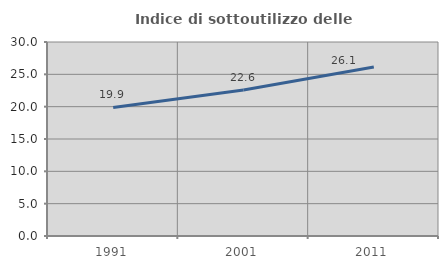
| Category | Indice di sottoutilizzo delle abitazioni  |
|---|---|
| 1991.0 | 19.887 |
| 2001.0 | 22.571 |
| 2011.0 | 26.128 |